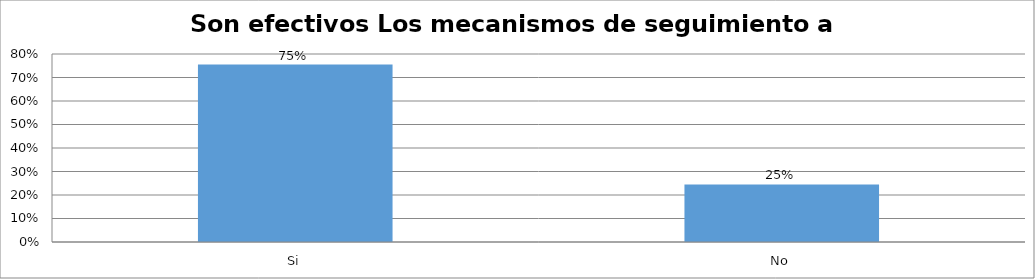
| Category | Series 0 |
|---|---|
| Si | 0.755 |
| No | 0.245 |